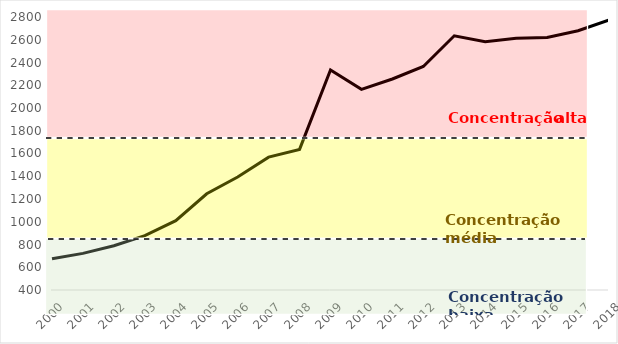
| Category | HHI |
|---|---|
| 2000 | 674 |
| 2001 | 722 |
| 2002 | 789 |
| 2003 | 878 |
| 2004 | 1009 |
| 2005 | 1246 |
| 2006 | 1393 |
| 2007 | 1568 |
| 2008 | 1636 |
| 2009 | 2335 |
| 2010 | 2164 |
| 2011 | 2255 |
| 2012 | 2365 |
| 2013 | 2635 |
| 2014 | 2582 |
| 2015 | 2614 |
| 2016 | 2619 |
| 2017 | 2679 |
| 2018 | 2773 |